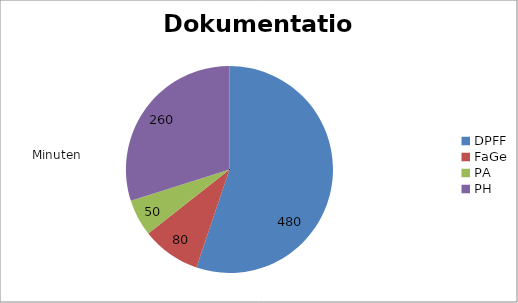
| Category | Dokumentation |
|---|---|
| DPFF | 480 |
| FaGe | 80 |
| PA | 50 |
| PH | 260 |